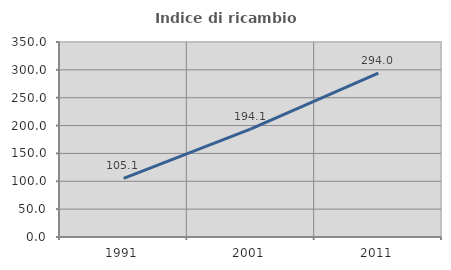
| Category | Indice di ricambio occupazionale  |
|---|---|
| 1991.0 | 105.093 |
| 2001.0 | 194.118 |
| 2011.0 | 293.966 |